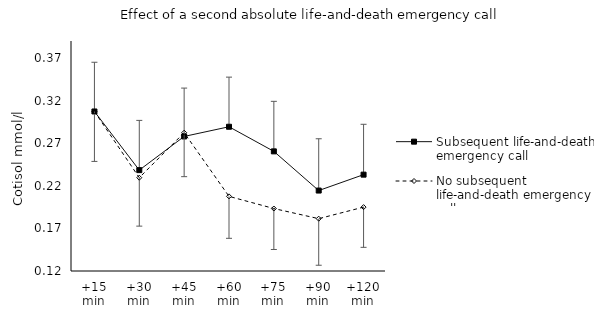
| Category | Subsequent life-and-death emergency call | No subsequent life-and-death emergency call |
|---|---|---|
| +15 min | 0.307 | 0.307 |
| +30 min | 0.238 | 0.23 |
| +45 min | 0.278 | 0.282 |
| +60 min | 0.289 | 0.208 |
| +75 min | 0.26 | 0.193 |
| +90 min | 0.214 | 0.181 |
| +120 min | 0.233 | 0.195 |